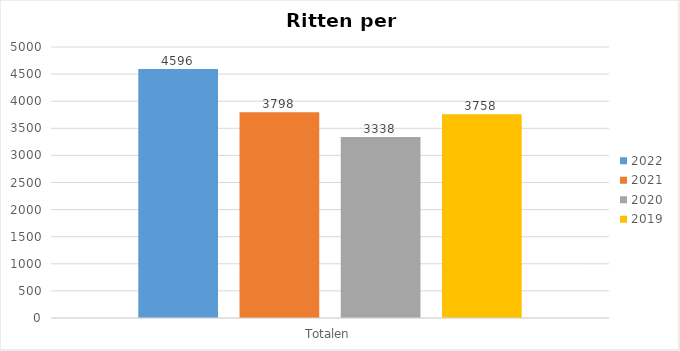
| Category | 2022 | 2021 | 2020 | 2019 |
|---|---|---|---|---|
| Totalen | 4596 | 3798 | 3338 | 3758 |